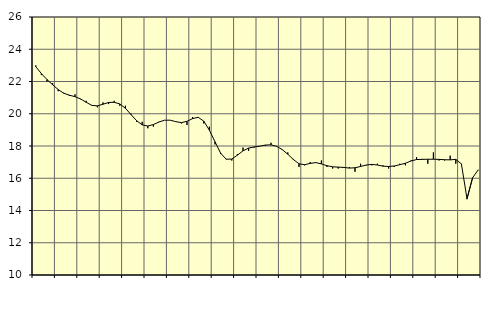
| Category | Piggar | Tillverkning o utvinning, energi o miljö, SNI 05-33, 35-39 |
|---|---|---|
| nan | 23 | 22.92 |
| 1.0 | 22.4 | 22.49 |
| 1.0 | 22 | 22.12 |
| 1.0 | 21.9 | 21.8 |
| nan | 21.4 | 21.5 |
| 2.0 | 21.3 | 21.27 |
| 2.0 | 21.1 | 21.15 |
| 2.0 | 21.2 | 21.06 |
| nan | 20.9 | 20.92 |
| 3.0 | 20.8 | 20.71 |
| 3.0 | 20.5 | 20.52 |
| 3.0 | 20.4 | 20.49 |
| nan | 20.7 | 20.59 |
| 4.0 | 20.6 | 20.7 |
| 4.0 | 20.8 | 20.71 |
| 4.0 | 20.5 | 20.61 |
| nan | 20.5 | 20.34 |
| 5.0 | 20 | 19.95 |
| 5.0 | 19.5 | 19.57 |
| 5.0 | 19.5 | 19.31 |
| nan | 19.1 | 19.24 |
| 6.0 | 19.2 | 19.33 |
| 6.0 | 19.5 | 19.49 |
| 6.0 | 19.6 | 19.6 |
| nan | 19.6 | 19.6 |
| 7.0 | 19.5 | 19.51 |
| 7.0 | 19.4 | 19.45 |
| 7.0 | 19.3 | 19.53 |
| nan | 19.8 | 19.7 |
| 8.0 | 19.8 | 19.78 |
| 8.0 | 19.4 | 19.54 |
| 8.0 | 19.2 | 18.98 |
| nan | 18.1 | 18.26 |
| 9.0 | 17.5 | 17.56 |
| 9.0 | 17.2 | 17.18 |
| 9.0 | 17.1 | 17.19 |
| nan | 17.5 | 17.43 |
| 10.0 | 17.9 | 17.7 |
| 10.0 | 17.7 | 17.87 |
| 10.0 | 17.9 | 17.94 |
| nan | 18 | 17.99 |
| 11.0 | 18 | 18.06 |
| 11.0 | 18.2 | 18.07 |
| 11.0 | 18 | 17.98 |
| nan | 17.8 | 17.78 |
| 12.0 | 17.6 | 17.49 |
| 12.0 | 17.2 | 17.16 |
| 12.0 | 16.7 | 16.9 |
| nan | 16.8 | 16.84 |
| 13.0 | 17 | 16.92 |
| 13.0 | 17 | 16.97 |
| 13.0 | 17.1 | 16.89 |
| nan | 16.7 | 16.78 |
| 14.0 | 16.6 | 16.71 |
| 14.0 | 16.6 | 16.69 |
| 14.0 | 16.7 | 16.67 |
| nan | 16.7 | 16.63 |
| 15.0 | 16.4 | 16.65 |
| 15.0 | 16.9 | 16.73 |
| 15.0 | 16.8 | 16.82 |
| nan | 16.8 | 16.86 |
| 16.0 | 16.9 | 16.82 |
| 16.0 | 16.8 | 16.75 |
| 16.0 | 16.6 | 16.73 |
| nan | 16.7 | 16.76 |
| 17.0 | 16.9 | 16.84 |
| 17.0 | 16.8 | 16.93 |
| 17.0 | 17.1 | 17.07 |
| nan | 17.3 | 17.16 |
| 18.0 | 17.2 | 17.17 |
| 18.0 | 16.9 | 17.18 |
| 18.0 | 17.6 | 17.18 |
| nan | 17.1 | 17.17 |
| 19.0 | 17.1 | 17.15 |
| 19.0 | 17.4 | 17.14 |
| 19.0 | 16.9 | 17.17 |
| nan | 16.9 | 16.89 |
| 20.0 | 14.7 | 14.73 |
| 20.0 | 16 | 16.03 |
| 20.0 | 16.5 | 16.52 |